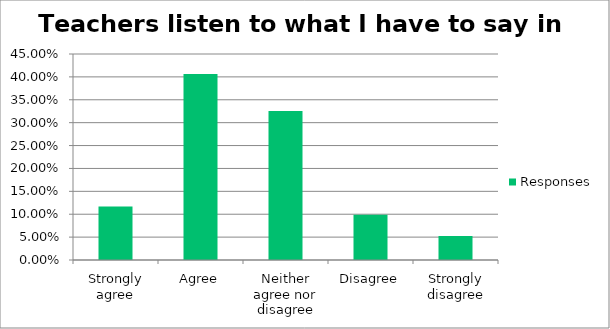
| Category | Responses |
|---|---|
| Strongly agree | 0.117 |
| Agree | 0.406 |
| Neither agree nor disagree | 0.326 |
| Disagree | 0.099 |
| Strongly disagree | 0.052 |